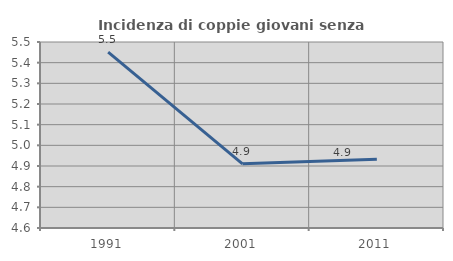
| Category | Incidenza di coppie giovani senza figli |
|---|---|
| 1991.0 | 5.451 |
| 2001.0 | 4.91 |
| 2011.0 | 4.933 |